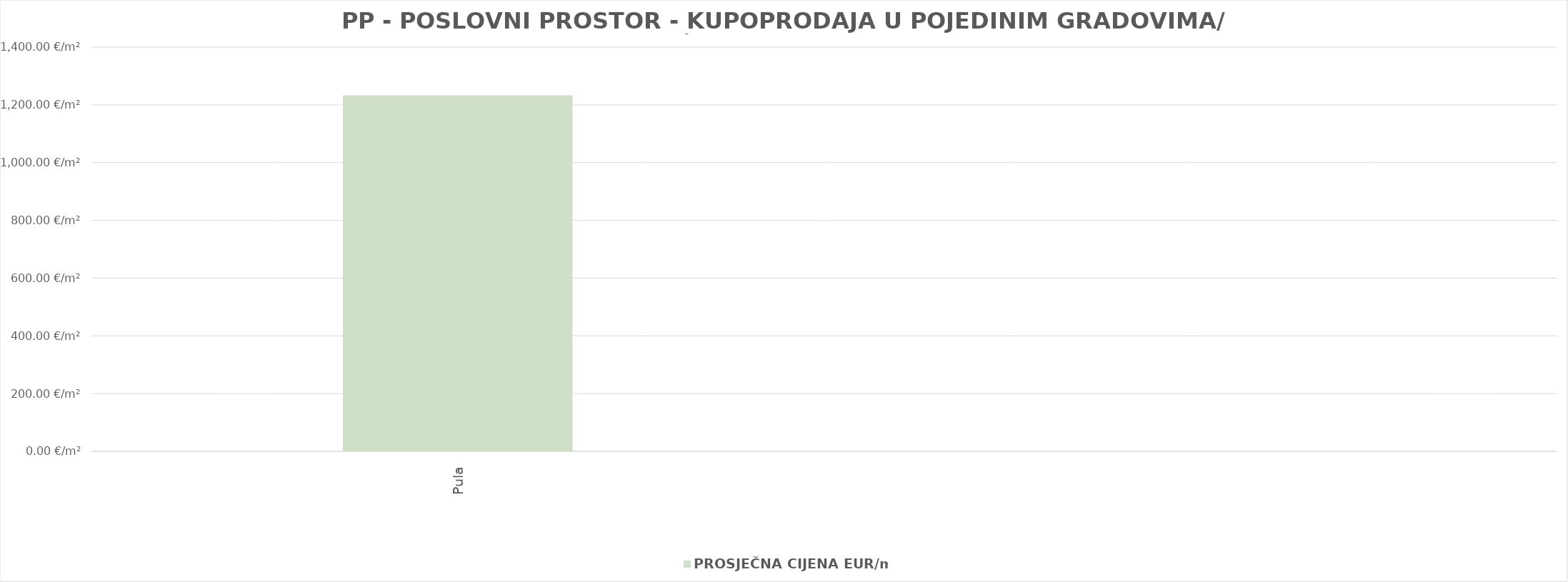
| Category | PROSJEČNA CIJENA EUR/m2 |
|---|---|
| Pula | 1903-05-17 00:03:14 |